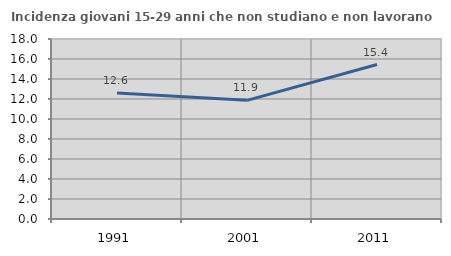
| Category | Incidenza giovani 15-29 anni che non studiano e non lavorano  |
|---|---|
| 1991.0 | 12.598 |
| 2001.0 | 11.863 |
| 2011.0 | 15.449 |